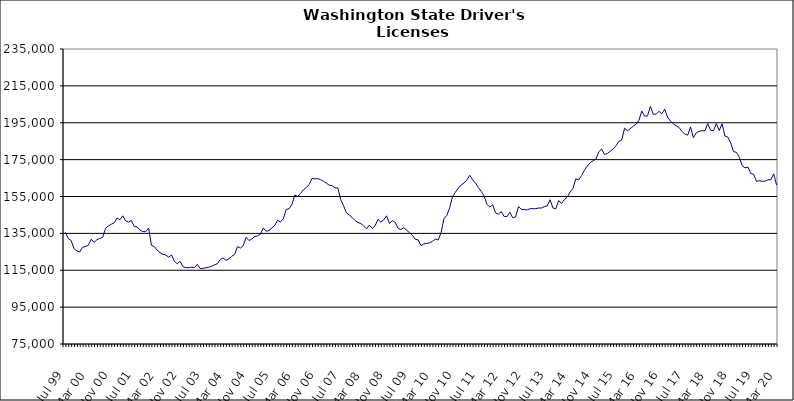
| Category | Series 0 |
|---|---|
| Jul 99 | 135560 |
| Aug 99 | 132182 |
| Sep 99 | 131104 |
| Oct 99 | 126694 |
| Nov 99 | 125425 |
| Dec 99 | 124927 |
| Jan 00 | 127499 |
| Feb 00 | 127927 |
| Mar 00 | 128547 |
| Apr 00 | 131834 |
| May 00 | 130120 |
| Jun 00 | 131595 |
| Jul 00 | 132236 |
| Aug 00 | 132819 |
| Sep 00 | 137711 |
| Oct 00 | 139063 |
| Nov 00 | 139952 |
| Dec 00 | 140732 |
| Jan 01 | 143338 |
| Feb 01 | 142359 |
| Mar 01 | 144523 |
| Apr 01 | 141758 |
| May 01 | 141135 |
| Jun 01 | 142064 |
| Jul 01 | 138646 |
| Aug 01 | 138530 |
| Sep 01 | 136784 |
| Oct 01 | 135996 |
| Nov 01 | 135917 |
| Dec 01 | 137940 |
| Jan 02 | 128531 |
| Feb 02 | 127848 |
| Mar 02 | 125876 |
| Apr 02 | 124595 |
| May 02 | 123660 |
| Jun 02 | 123282 |
| Jul 02 | 122089 |
| Aug 02 | 123279 |
| Sep 02 | 119727 |
| Oct 02 | 118588 |
| Nov 02 | 119854 |
| Dec 02 | 116851 |
| Jan 03 | 116407 |
| Feb 03 | 116382 |
| Mar 03 | 116648 |
| Apr 03 | 116471 |
| May 03 | 118231 |
| Jun 03 | 115831 |
| Jul 03 | 116082 |
| Aug 03 | 116341 |
| Sep 03 | 116653 |
| Oct 03 | 117212 |
| Nov 03 | 117962 |
| Dec 03 | 118542 |
| Jan 04 | 120817 |
| Feb 04 | 121617 |
| Mar 04 | 120369 |
| Apr 04 | 121200 |
| May 04 | 122609 |
| Jun 04 | 123484 |
| Jul 04 | 127844 |
| Aug 04 | 127025 |
| Sep 04 | 128273 |
| Oct 04 | 132853 |
| Nov 04 | 131106 |
| Dec 04 | 131935 |
| Jan 05 | 133205 |
| Feb 05 | 133736 |
| Mar 05 | 134528 |
| Apr 05 | 137889 |
| May 05 | 136130 |
| Jun 05 | 136523 |
| Jul 05 | 137997 |
| Aug 05 | 139294 |
| Sep 05 | 142140 |
| Oct 05 | 141192 |
| Nov 05 | 142937 |
| Dec 05 | 148013 |
| Jan 06 | 148341 |
| Feb 06 | 150744 |
| Mar 06 | 155794 |
| Apr 06 | 154984 |
| May 06 | 156651 |
| Jun 06 | 158638 |
| Jul 06 | 159911 |
| Aug 06 | 161445 |
| Sep 06 | 164852 |
| Oct 06 | 164570 |
| Nov 06 | 164679 |
| Dec 06 | 164127 |
| Jan 07 | 163271 |
| Feb 07 | 162273 |
| Mar 07 | 161140 |
| Apr 07 | 160860 |
| May 07 | 159633 |
| Jun 07 | 159724 |
| Jul 07 | 153303 |
| Aug 07 | 149939 |
| Sep 07 | 146172 |
| Oct 07 | 144876 |
| Nov 07 | 143613 |
| Dec 07 | 142022 |
| Jan 08 | 140909 |
| Feb 08 | 140368 |
| Mar 08 | 138998 |
| Apr 08 | 137471 |
| May 08 | 139453 |
| Jun 08 | 137680 |
| Jul 08 | 139120 |
| Aug 08 | 142612 |
| Sep-08 | 141071 |
| Oct 08 | 142313 |
| Nov 08 | 144556 |
| Dec 08 | 140394 |
| Jan 09 | 141903 |
| Feb 09 | 141036 |
| Mar 09 | 137751 |
| Apr 09 | 137060 |
| May 09 | 138101 |
| Jun 09 | 136739 |
| Jul 09 | 135317 |
| Aug 09 | 134020 |
| Sep 09 | 131756 |
| Oct 09 | 131488 |
| Nov 09 | 128370 |
| Dec 09 | 129323 |
| Jan 10 | 129531 |
| Feb 10 | 129848 |
| Mar 10 | 130654 |
| Apr 10 | 131929 |
| May 10 | 131429 |
| Jun 10 | 135357 |
| Jul 10 | 143032 |
| Aug 10 | 144686 |
| Sep 10 | 148856 |
| Oct 10 | 155042 |
| Nov 10 | 157328 |
| Dec 10 | 159501 |
| Jan 11 | 161221 |
| Feb 11 | 162312 |
| Mar 11 | 163996 |
| Apr 11 | 166495 |
| May 11 | 164040 |
| Jun 11 | 162324 |
| Jul 11 | 159862 |
| Aug 11 | 157738 |
| Sep 11 | 155430 |
| Oct 11 | 150762 |
| Nov 11 | 149255 |
| Dec 11 | 150533 |
| Jan 12 | 146068 |
| Feb 12 | 145446 |
| Mar 12 | 146788 |
| Apr 12 | 144110 |
| May 12 | 144162 |
| Jun 12 | 146482 |
| Jul 12 | 143445 |
| Aug 12 | 143950 |
| Sep 12 | 149520 |
| Oct 12 | 148033 |
| Nov 12 | 147926 |
| Dec 12 | 147674 |
| Jan 13 | 148360 |
| Feb-13 | 148388 |
| Mar-13 | 148414 |
| Apr 13 | 148749 |
| May 13 | 148735 |
| Jun-13 | 149521 |
| Jul 13 | 149837 |
| Aug 13 | 153252 |
| Sep 13 | 148803 |
| Oct 13 | 148315 |
| Nov 13 | 152804 |
| Dec 13 | 151209 |
| Jan 14 | 153357 |
| Feb-14 | 154608 |
| Mar 14 | 157479 |
| Apr 14 | 159441 |
| May 14 | 164591 |
| Jun 14 | 163995 |
| Jul-14 | 166411 |
| Aug-14 | 169272 |
| Sep 14 | 171565 |
| Oct 14 | 173335 |
| Nov 14 | 174406 |
| Dec 14 | 175302 |
| Jan 15 | 179204 |
| Feb 15 | 180737 |
| Mar 15 | 177810 |
| Apr-15 | 178331 |
| May 15 | 179601 |
| Jun-15 | 180729 |
| Jul 15 | 182540 |
| Aug 15 | 184924 |
| Sep 15 | 185620 |
| Oct 15 | 192002 |
| Nov 15 | 190681 |
| Dec 15 | 191795 |
| Jan 16 | 193132 |
| Feb 16 | 194206 |
| Mar 16 | 196319 |
| Apr 16 | 201373 |
| May 16 | 198500 |
| Jun 16 | 198743 |
| Jul 16 | 203841 |
| Aug 16 | 199630 |
| Sep 16 | 199655 |
| Oct 16 | 201181 |
| Nov 16 | 199888 |
| Dec 16 | 202304 |
| Jan 17 | 197977 |
| Feb 17 | 195889 |
| Mar 17 | 194438 |
| Apr 17 | 193335 |
| May 17 | 192430 |
| Jun 17 | 190298 |
| Jul 17 | 188832 |
| Aug 17 | 188264 |
| Sep 17 | 192738 |
| Oct 17 | 186856 |
| Nov 17 | 189537 |
| Dec 17 | 190341 |
| Jan 18 | 190670 |
| Feb 18 | 190645 |
| Mar 18 | 194476 |
| Apr 18 | 190971 |
| May 18 | 190707 |
| Jun 18 | 194516 |
| Jul 18 | 190783 |
| Aug 18 | 194390 |
| Sep 18 | 187831 |
| Oct 18 | 187188 |
| Nov 18 | 184054 |
| Dec 18 | 179347 |
| Jan 19 | 178958 |
| Feb 19 | 176289 |
| Mar 19 | 171747 |
| Apr 19 | 170532 |
| May 19 | 170967 |
| Jun 19 | 167444 |
| Jul 19 | 167059 |
| Aug 19 | 163194 |
| Sep 19 | 163599 |
| Oct 19 | 163212 |
| Nov 19 | 163388 |
| Dec 19 | 164024 |
| Jan 20 | 164114 |
| Feb 20 | 167320 |
| Mar 20 | 161221 |